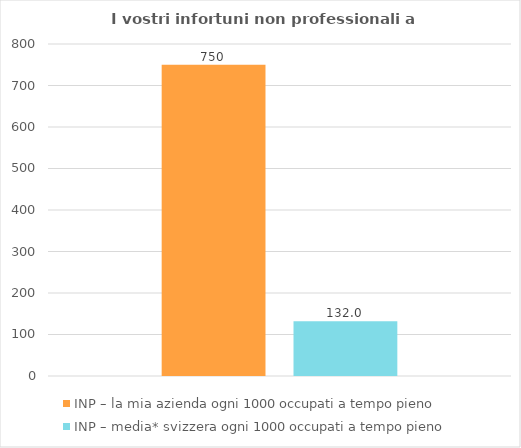
| Category | INP – la mia azienda ogni 1000 occupati a tempo pieno | INP – media* svizzera ogni 1000 occupati a tempo pieno |
|---|---|---|
| 0 | 750 | 132 |